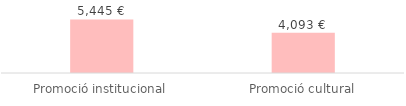
| Category | Total |
|---|---|
| Promoció institucional | 5445 |
| Promoció cultural | 4093 |